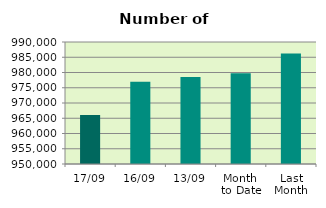
| Category | Series 0 |
|---|---|
| 17/09 | 966076 |
| 16/09 | 976984 |
| 13/09 | 978520 |
| Month 
to Date | 979772.833 |
| Last
Month | 986270.455 |